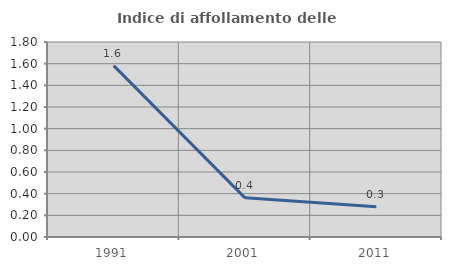
| Category | Indice di affollamento delle abitazioni  |
|---|---|
| 1991.0 | 1.582 |
| 2001.0 | 0.361 |
| 2011.0 | 0.279 |